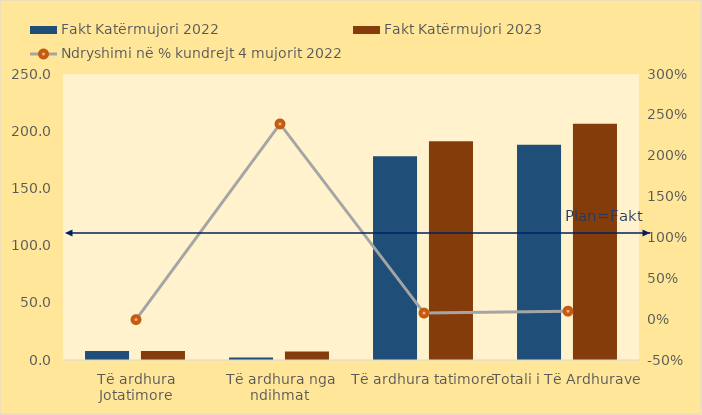
| Category | Fakt Katërmujori 2022 | Fakt Katërmujori 2023 |
|---|---|---|
| Të ardhura Jotatimore | 7.909 | 7.863 |
| Të ardhura nga ndihmat | 2.167 | 7.345 |
| Të ardhura tatimore | 178.083 | 191.289 |
| Totali i Të Ardhurave | 188.159 | 206.498 |